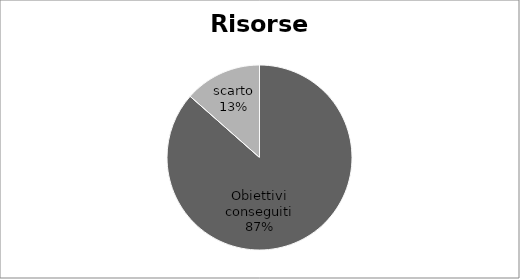
| Category | Series 0 |
|---|---|
| Obiettivi conseguiti | 86.5 |
| scarto | 13.5 |